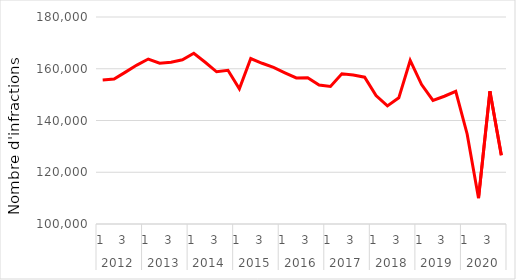
| Category | Série CVS-CJO |
|---|---|
| 0 | 155665.684 |
| 1 | 156005.726 |
| 2 | 158686.849 |
| 3 | 161412.46 |
| 4 | 163754.116 |
| 5 | 162158.825 |
| 6 | 162547.142 |
| 7 | 163444.001 |
| 8 | 165970.463 |
| 9 | 162500.798 |
| 10 | 158824.352 |
| 11 | 159414.423 |
| 12 | 152233.379 |
| 13 | 163958.797 |
| 14 | 162118.16 |
| 15 | 160496.857 |
| 16 | 158432.011 |
| 17 | 156448.536 |
| 18 | 156541.282 |
| 19 | 153721.942 |
| 20 | 153164.093 |
| 21 | 158027.591 |
| 22 | 157560.575 |
| 23 | 156751.053 |
| 24 | 149602.195 |
| 25 | 145641.655 |
| 26 | 148759.378 |
| 27 | 163209.071 |
| 28 | 153897.5 |
| 29 | 147768.954 |
| 30 | 149378.481 |
| 31 | 151258.522 |
| 32 | 134797.372 |
| 33 | 109993.464 |
| 34 | 151286.547 |
| 35 | 126605.764 |